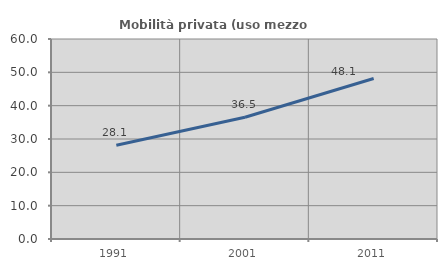
| Category | Mobilità privata (uso mezzo privato) |
|---|---|
| 1991.0 | 28.148 |
| 2001.0 | 36.508 |
| 2011.0 | 48.148 |